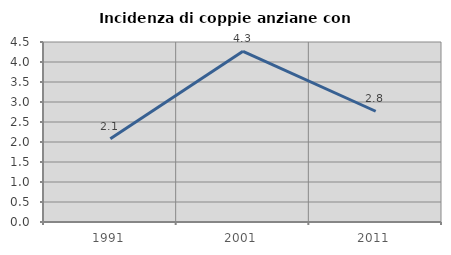
| Category | Incidenza di coppie anziane con figli |
|---|---|
| 1991.0 | 2.083 |
| 2001.0 | 4.266 |
| 2011.0 | 2.769 |